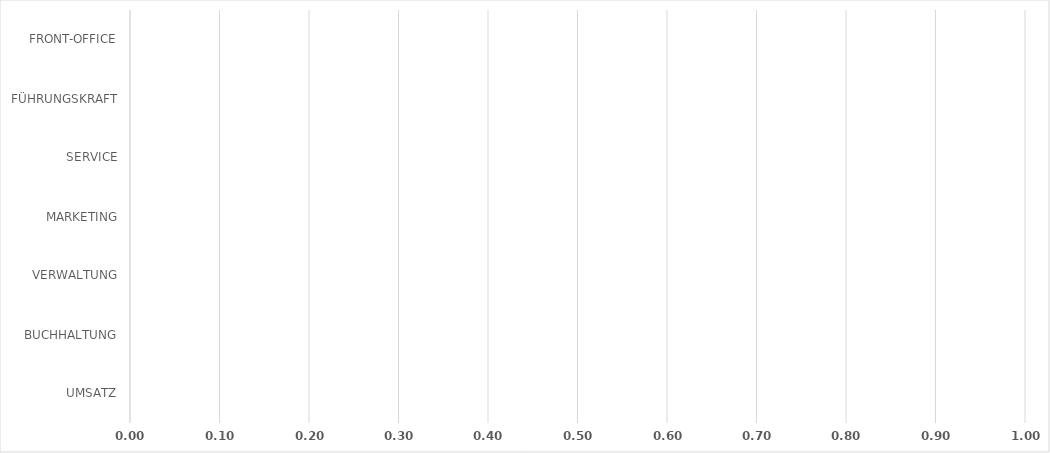
| Category | Series 0 |
|---|---|
| UMSATZ | 0 |
| BUCHHALTUNG | 0 |
| VERWALTUNG | 0 |
| MARKETING | 0 |
| SERVICE | 0 |
| FÜHRUNGSKRAFT | 0 |
| FRONT-OFFICE | 0 |